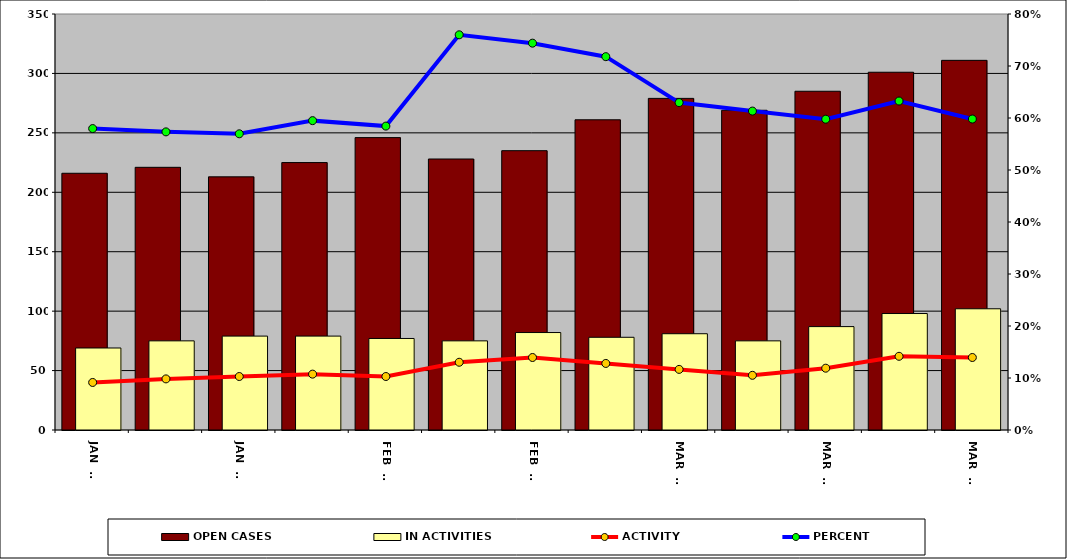
| Category | OPEN CASES | IN ACTIVITIES |
|---|---|---|
| JUL  04 | 216 | 69 |
| JUL  11 | 221 | 75 |
| JUL  18 | 213 | 79 |
| JUL  25 | 225 | 79 |
| AUG  01 | 246 | 77 |
| AUG  08 | 228 | 75 |
| AUG  15 | 235 | 82 |
| AUG  22 | 261 | 78 |
| AUG 29 | 279 | 81 |
| SEP 05 | 269 | 75 |
| SEP 12 | 285 | 87 |
| SEP 19 | 301 | 98 |
| SEP 26 | 311 | 102 |